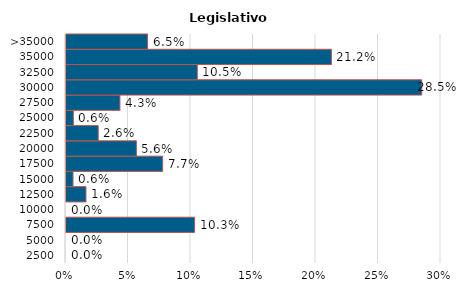
| Category | Legislativo |
|---|---|
| 2500 | 0 |
| 5000 | 0 |
| 7500 | 0.103 |
| 10000 | 0 |
| 12500 | 0.016 |
| 15000 | 0.006 |
| 17500 | 0.077 |
| 20000 | 0.056 |
| 22500 | 0.026 |
| 25000 | 0.006 |
| 27500 | 0.043 |
| 30000 | 0.285 |
| 32500 | 0.105 |
| 35000 | 0.212 |
| >35000 | 0.065 |